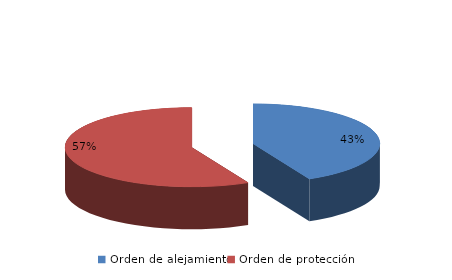
| Category | Series 0 |
|---|---|
| Orden de alejamiento | 305 |
| Orden de protección | 410 |